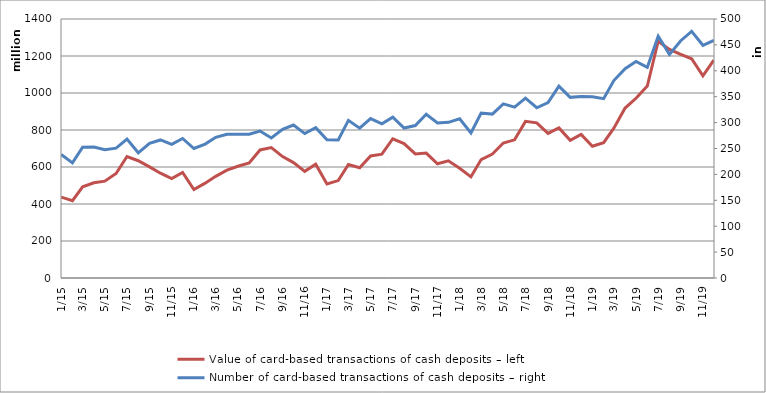
| Category | Value of card-based transactions of cash deposits – left |
|---|---|
| 2015-01-01 | 437462560 |
| 2015-02-01 | 417761716 |
| 2015-03-01 | 492701186 |
| 2015-04-01 | 514748639 |
| 2015-05-01 | 523356216 |
| 2015-06-01 | 565057359 |
| 2015-07-01 | 656724490 |
| 2015-08-01 | 633881607 |
| 2015-09-01 | 600851477 |
| 2015-10-01 | 566406333 |
| 2015-11-01 | 536919616 |
| 2015-12-01 | 570165983 |
| 2016-01-01 | 478170461 |
| 2016-02-01 | 512639713 |
| 2016-03-01 | 549693473 |
| 2016-04-01 | 582699966 |
| 2016-05-01 | 604174778 |
| 2016-06-01 | 622450135 |
| 2016-07-01 | 692048756 |
| 2016-08-01 | 705028115 |
| 2016-09-01 | 656237175 |
| 2016-10-01 | 623918776 |
| 2016-11-01 | 576348944 |
| 2016-12-01 | 614910660 |
| 2017-01-01 | 508412726 |
| 2017-02-01 | 526671084 |
| 2017-03-01 | 613709645 |
| 2017-04-01 | 595689390 |
| 2017-05-01 | 660001053 |
| 2017-06-01 | 669163059 |
| 2017-07-01 | 752679258 |
| 2017-08-01 | 726381733 |
| 2017-09-01 | 670881190 |
| 2017-10-01 | 675163013 |
| 2017-11-01 | 617721565 |
| 2017-12-01 | 633509667 |
| 2018-01-01 | 593537981 |
| 2018-02-01 | 546771376 |
| 2018-03-01 | 640220334 |
| 2018-04-01 | 670424716 |
| 2018-05-01 | 729402406 |
| 2018-06-01 | 746835020 |
| 2018-07-01 | 846583207 |
| 2018-08-01 | 838599137 |
| 2018-09-01 | 781815328 |
| 2018-10-01 | 811370008 |
| 2018-11-01 | 743921866 |
| 2018-12-01 | 775906947 |
| 2019-01-01 | 712063577 |
| 2019-02-01 | 731526323 |
| 2019-03-01 | 809962786 |
| 2019-04-01 | 918558884 |
| 2019-05-01 | 971331588 |
| 2019-06-01 | 1037259537 |
| 2019-07-01 | 1280040384 |
| 2019-08-01 | 1235110215 |
| 2019-09-01 | 1209231103 |
| 2019-10-01 | 1185027154 |
| 2019-11-01 | 1093111411 |
| 2019-12-01 | 1177787327 |